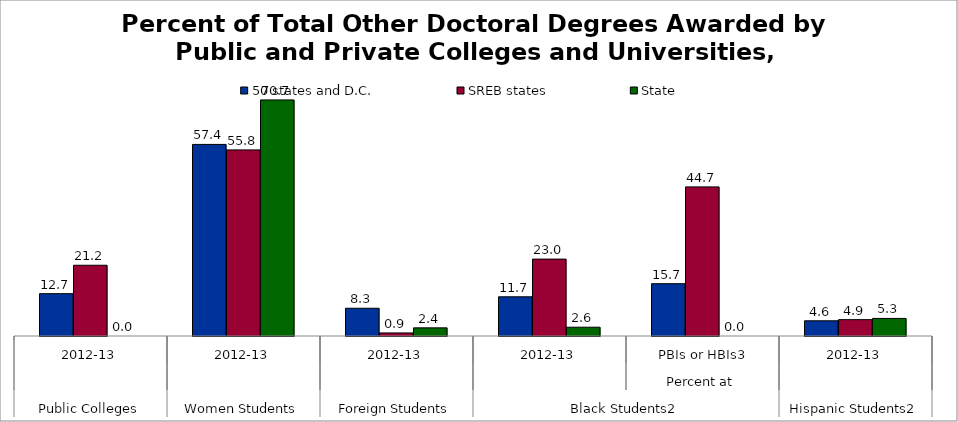
| Category | 50 states and D.C. | SREB states | State |
|---|---|---|---|
| 0 | 12.691 | 21.198 | 0 |
| 1 | 57.403 | 55.76 | 70.732 |
| 2 | 8.315 | 0.922 | 2.439 |
| 3 | 11.744 | 23.039 | 2.632 |
| 4 | 15.672 | 44.681 | 0 |
| 5 | 4.557 | 4.902 | 5.263 |